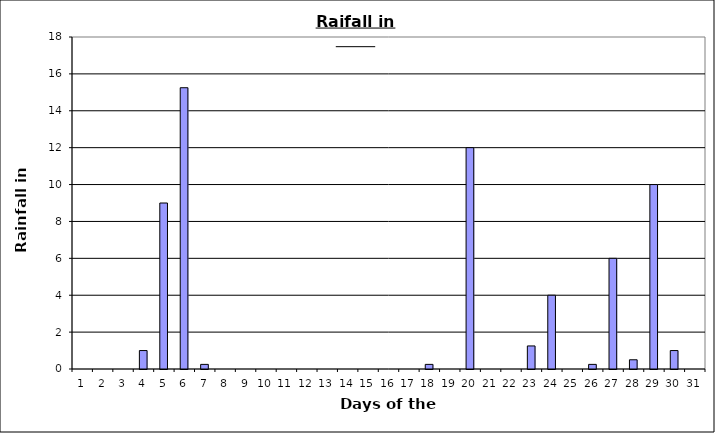
| Category | Series 0 |
|---|---|
| 0 | 0 |
| 1 | 0 |
| 2 | 0 |
| 3 | 1 |
| 4 | 9 |
| 5 | 15.25 |
| 6 | 0.25 |
| 7 | 0 |
| 8 | 0 |
| 9 | 0 |
| 10 | 0 |
| 11 | 0 |
| 12 | 0 |
| 13 | 0 |
| 14 | 0 |
| 15 | 0 |
| 16 | 0 |
| 17 | 0.25 |
| 18 | 0 |
| 19 | 12 |
| 20 | 0 |
| 21 | 0 |
| 22 | 1.25 |
| 23 | 4 |
| 24 | 0 |
| 25 | 0.25 |
| 26 | 6 |
| 27 | 0.5 |
| 28 | 10 |
| 29 | 1 |
| 30 | 0 |